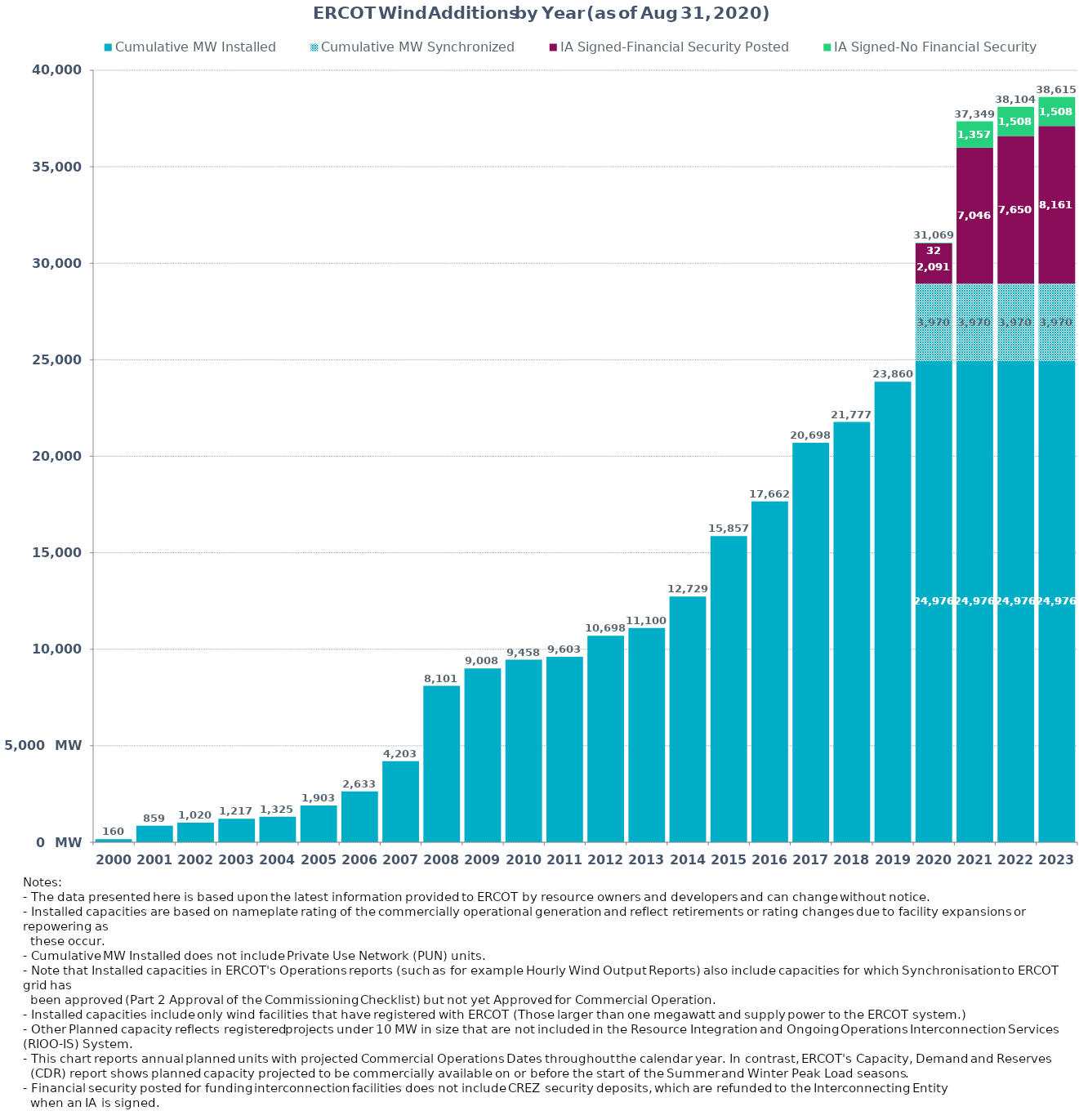
| Category | Cumulative MW Installed | Cumulative MW Synchronized | IA Signed-Financial Security Posted  | IA Signed-No Financial Security  | Other Planned | Cumulative Installed and Planned |
|---|---|---|---|---|---|---|
| 2000.0 | 160.37 | 0 | 0 | 0 | 0 | 160.37 |
| 2001.0 | 859.29 | 0 | 0 | 0 | 0 | 859.29 |
| 2002.0 | 1019.79 | 0 | 0 | 0 | 0 | 1019.79 |
| 2003.0 | 1217.29 | 0 | 0 | 0 | 0 | 1217.29 |
| 2004.0 | 1325.29 | 0 | 0 | 0 | 0 | 1325.29 |
| 2005.0 | 1902.69 | 0 | 0 | 0 | 0 | 1902.69 |
| 2006.0 | 2633.39 | 0 | 0 | 0 | 0 | 2633.39 |
| 2007.0 | 4203.41 | 0 | 0 | 0 | 0 | 4203.41 |
| 2008.0 | 8101.01 | 0 | 0 | 0 | 0 | 8101.01 |
| 2009.0 | 9007.57 | 0 | 0 | 0 | 0 | 9007.57 |
| 2010.0 | 9458.49 | 0 | 0 | 0 | 0 | 9458.49 |
| 2011.0 | 9603.49 | 0 | 0 | 0 | 0 | 9603.49 |
| 2012.0 | 10698.35 | 0 | 0 | 0 | 0 | 10698.35 |
| 2013.0 | 11100.05 | 0 | 0 | 0 | 0 | 11100.05 |
| 2014.0 | 12728.93 | 0 | 0 | 0 | 0 | 12728.93 |
| 2015.0 | 15857.48 | 0 | 0 | 0 | 0 | 15857.48 |
| 2016.0 | 17662.45 | 0 | 0 | 0 | 0 | 17662.45 |
| 2017.0 | 20697.84 | 0 | 0 | 0 | 0 | 20697.84 |
| 2018.0 | 21777 | 0 | 0 | 0 | 0 | 21777 |
| 2019.0 | 23860 | 0 | 0 | 0 | 0 | 23860 |
| 2020.0 | 24975.68 | 3970.41 | 2091.4 | 32 | 0 | 31069.49 |
| 2021.0 | 24975.68 | 3970.41 | 7046.46 | 1356.89 | 0 | 37349.44 |
| 2022.0 | 24975.68 | 3970.41 | 7650 | 1508 | 0 | 38104.09 |
| 2023.0 | 24975.68 | 3970.41 | 8161.06 | 1508 | 0 | 38615.15 |